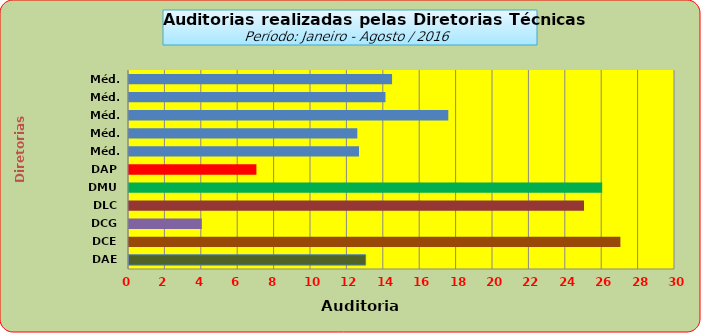
| Category | Series 0 |
|---|---|
| DAE | 13 |
| DCE | 27 |
| DCG | 4 |
| DLC | 25 |
| DMU | 26 |
| DAP | 7 |
| Méd. 2011 | 12.636 |
| Méd. 2012 | 12.545 |
| Méd. 2013 | 17.545 |
| Méd. 2014 | 14.091 |
| Méd. 2014 | 14.455 |